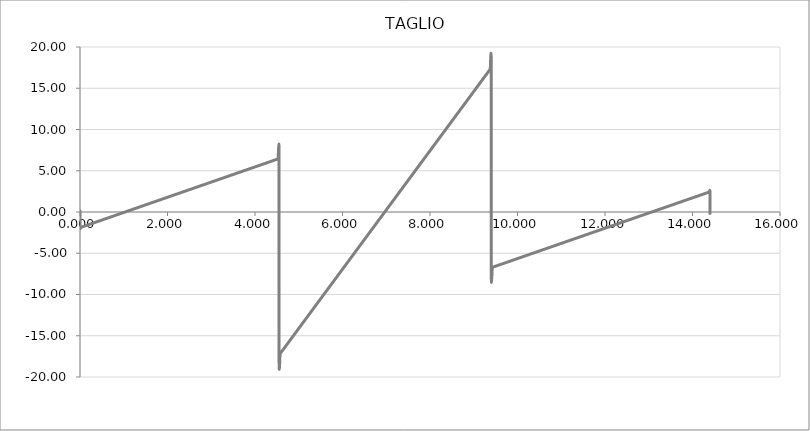
| Category | Series 1 |
|---|---|
| 0.0 | 0 |
| 0.0 | 0 |
| 0.0 | 0 |
| 0.0 | 0 |
| 0.0 | 0 |
| 0.0 | 0 |
| 0.0 | 0 |
| 0.0 | 0 |
| 0.0 | 0 |
| 0.0 | 0 |
| 0.0 | 0 |
| 0.0 | 0 |
| 0.0 | 0 |
| 0.0 | 0 |
| 0.0 | 0 |
| 0.0 | 0 |
| 0.0 | 0 |
| 0.0 | 0 |
| 0.0 | 0 |
| 0.0 | 0 |
| 0.0 | 0 |
| 0.0 | 0 |
| 0.0 | 0 |
| 0.0 | 0 |
| 0.0 | 0 |
| 0.0 | 0 |
| 0.0 | 0 |
| 0.0 | 0 |
| 0.0 | 0 |
| 0.0 | 0 |
| 0.0 | 0 |
| 0.0 | 0 |
| 0.0 | 0 |
| 0.0 | 0 |
| 0.0 | 0 |
| 0.0 | 0 |
| 0.0 | 0 |
| 0.0 | 0 |
| 0.0 | 0 |
| 0.0 | 0 |
| 0.0 | 0 |
| 0.0 | 0 |
| 0.0 | 0 |
| 0.0 | 0 |
| 0.0 | 0 |
| 0.0 | 0 |
| 0.0 | 0 |
| 0.0 | 0 |
| 0.0 | 0 |
| 0.0 | 0 |
| 0.0 | 0 |
| 0.0 | 0 |
| 0.0 | 0 |
| 0.0 | 0 |
| 0.0 | 0 |
| 0.0 | 0 |
| 0.0 | 0 |
| 0.0 | 0 |
| 0.0 | 0 |
| 0.0 | 0 |
| 0.0 | 0 |
| 0.0 | 0 |
| 0.0 | 0 |
| 0.0 | 0 |
| 0.0 | 0 |
| 0.0 | 0 |
| 0.0 | 0 |
| 0.0 | 0 |
| 0.0 | 0 |
| 0.0 | 0 |
| 0.0 | 0 |
| 0.0 | 0 |
| 0.0 | 0 |
| 0.0 | 0 |
| 0.0 | 0 |
| 0.0 | 0 |
| 0.0 | 0 |
| 0.0 | 0 |
| 0.0 | 0 |
| 0.0 | 0 |
| 0.0 | 0 |
| 0.0 | 0 |
| 0.0 | 0 |
| 0.0 | 0 |
| 0.0 | 0 |
| 0.0 | 0 |
| 0.0 | 0 |
| 0.0 | 0 |
| 0.0 | 0 |
| 0.0 | 0 |
| 0.0 | 0 |
| 0.0 | 0 |
| 0.0 | 0 |
| 0.0 | 0 |
| 0.0 | 0 |
| 0.0 | 0 |
| 0.0 | 0 |
| 0.0 | 0 |
| 0.0 | 0 |
| 0.0 | 0 |
| 0.0 | 0 |
| 0.0 | -1.895 |
| 0.02275 | -1.853 |
| 0.0455 | -1.811 |
| 0.06825 | -1.769 |
| 0.091 | -1.727 |
| 0.11374999999999999 | -1.686 |
| 0.1365 | -1.644 |
| 0.15925 | -1.602 |
| 0.182 | -1.56 |
| 0.20475 | -1.518 |
| 0.22749999999999998 | -1.476 |
| 0.25025 | -1.434 |
| 0.273 | -1.393 |
| 0.29575 | -1.351 |
| 0.3185 | -1.309 |
| 0.34125 | -1.267 |
| 0.364 | -1.225 |
| 0.38675 | -1.183 |
| 0.4095 | -1.141 |
| 0.43224999999999997 | -1.099 |
| 0.45499999999999996 | -1.058 |
| 0.47775 | -1.016 |
| 0.5005 | -0.974 |
| 0.52325 | -0.932 |
| 0.546 | -0.89 |
| 0.56875 | -0.848 |
| 0.5915 | -0.806 |
| 0.61425 | -0.765 |
| 0.637 | -0.723 |
| 0.65975 | -0.681 |
| 0.6825 | -0.639 |
| 0.7052499999999999 | -0.597 |
| 0.728 | -0.555 |
| 0.75075 | -0.513 |
| 0.7735 | -0.472 |
| 0.79625 | -0.43 |
| 0.819 | -0.388 |
| 0.84175 | -0.346 |
| 0.8644999999999999 | -0.304 |
| 0.88725 | -0.262 |
| 0.9099999999999999 | -0.22 |
| 0.93275 | -0.179 |
| 0.9555 | -0.137 |
| 0.97825 | -0.095 |
| 1.001 | -0.053 |
| 1.02375 | -0.011 |
| 1.0465 | 0.031 |
| 1.06925 | 0.073 |
| 1.092 | 0.114 |
| 1.11475 | 0.156 |
| 1.1375 | 0.198 |
| 1.16025 | 0.24 |
| 1.183 | 0.282 |
| 1.2057499999999999 | 0.324 |
| 1.2285 | 0.366 |
| 1.25125 | 0.407 |
| 1.274 | 0.449 |
| 1.29675 | 0.491 |
| 1.3195 | 0.533 |
| 1.34225 | 0.575 |
| 1.365 | 0.617 |
| 1.38775 | 0.659 |
| 1.4104999999999999 | 0.7 |
| 1.43325 | 0.742 |
| 1.456 | 0.784 |
| 1.47875 | 0.826 |
| 1.5015 | 0.868 |
| 1.5242499999999999 | 0.91 |
| 1.547 | 0.952 |
| 1.56975 | 0.994 |
| 1.5925 | 1.035 |
| 1.6152499999999999 | 1.077 |
| 1.638 | 1.119 |
| 1.66075 | 1.161 |
| 1.6835 | 1.203 |
| 1.70625 | 1.245 |
| 1.7289999999999999 | 1.287 |
| 1.75175 | 1.328 |
| 1.7745 | 1.37 |
| 1.79725 | 1.412 |
| 1.8199999999999998 | 1.454 |
| 1.8427499999999999 | 1.496 |
| 1.8655 | 1.538 |
| 1.88825 | 1.58 |
| 1.911 | 1.621 |
| 1.9337499999999999 | 1.663 |
| 1.9565 | 1.705 |
| 1.97925 | 1.747 |
| 2.002 | 1.789 |
| 2.02475 | 1.831 |
| 2.0475 | 1.873 |
| 2.07025 | 1.914 |
| 2.093 | 1.956 |
| 2.11575 | 1.998 |
| 2.1385 | 2.04 |
| 2.16125 | 2.082 |
| 2.184 | 2.124 |
| 2.20675 | 2.166 |
| 2.2295 | 2.207 |
| 2.25225 | 2.249 |
| 2.275 | 2.291 |
| 2.2977499999999997 | 2.333 |
| 2.3205 | 2.375 |
| 2.34325 | 2.417 |
| 2.366 | 2.459 |
| 2.38875 | 2.5 |
| 2.4114999999999998 | 2.542 |
| 2.43425 | 2.584 |
| 2.457 | 2.626 |
| 2.47975 | 2.668 |
| 2.5025 | 2.71 |
| 2.5252499999999998 | 2.752 |
| 2.548 | 2.793 |
| 2.57075 | 2.835 |
| 2.5935 | 2.877 |
| 2.61625 | 2.919 |
| 2.639 | 2.961 |
| 2.66175 | 3.003 |
| 2.6845 | 3.045 |
| 2.7072499999999997 | 3.087 |
| 2.73 | 3.128 |
| 2.75275 | 3.17 |
| 2.7755 | 3.212 |
| 2.79825 | 3.254 |
| 2.8209999999999997 | 3.296 |
| 2.84375 | 3.338 |
| 2.8665 | 3.38 |
| 2.88925 | 3.421 |
| 2.912 | 3.463 |
| 2.9347499999999997 | 3.505 |
| 2.9575 | 3.547 |
| 2.98025 | 3.589 |
| 3.003 | 3.631 |
| 3.02575 | 3.673 |
| 3.0484999999999998 | 3.714 |
| 3.07125 | 3.756 |
| 3.094 | 3.798 |
| 3.11675 | 3.84 |
| 3.1395 | 3.882 |
| 3.16225 | 3.924 |
| 3.185 | 3.966 |
| 3.20775 | 4.007 |
| 3.2304999999999997 | 4.049 |
| 3.25325 | 4.091 |
| 3.276 | 4.133 |
| 3.29875 | 4.175 |
| 3.3215 | 4.217 |
| 3.3442499999999997 | 4.259 |
| 3.367 | 4.3 |
| 3.38975 | 4.342 |
| 3.4125 | 4.384 |
| 3.43525 | 4.426 |
| 3.4579999999999997 | 4.468 |
| 3.48075 | 4.51 |
| 3.5035 | 4.552 |
| 3.52625 | 4.593 |
| 3.549 | 4.635 |
| 3.5717499999999998 | 4.677 |
| 3.5945 | 4.719 |
| 3.61725 | 4.761 |
| 3.6399999999999997 | 4.803 |
| 3.66275 | 4.845 |
| 3.6854999999999998 | 4.886 |
| 3.70825 | 4.928 |
| 3.731 | 4.97 |
| 3.7537499999999997 | 5.012 |
| 3.7765 | 5.054 |
| 3.79925 | 5.096 |
| 3.822 | 5.138 |
| 3.84475 | 5.18 |
| 3.8674999999999997 | 5.221 |
| 3.89025 | 5.263 |
| 3.913 | 5.305 |
| 3.93575 | 5.347 |
| 3.9585 | 5.389 |
| 3.9812499999999997 | 5.431 |
| 4.004 | 5.473 |
| 4.02675 | 5.514 |
| 4.0495 | 5.556 |
| 4.0722499999999995 | 5.598 |
| 4.095 | 5.64 |
| 4.11775 | 5.682 |
| 4.1405 | 5.724 |
| 4.16325 | 5.766 |
| 4.186 | 5.807 |
| 4.20875 | 5.849 |
| 4.2315 | 5.891 |
| 4.25425 | 5.933 |
| 4.277 | 5.975 |
| 4.2997499999999995 | 6.017 |
| 4.3225 | 6.059 |
| 4.34525 | 6.1 |
| 4.368 | 6.142 |
| 4.39075 | 6.184 |
| 4.4135 | 6.226 |
| 4.43625 | 6.268 |
| 4.459 | 6.31 |
| 4.48175 | 6.352 |
| 4.5045 | 6.393 |
| 4.5272499999999996 | 6.435 |
| 4.55 | 6.477 |
| 4.55 | -17.345 |
| 4.57425 | -17.171 |
| 4.5985 | -16.997 |
| 4.62275 | -16.823 |
| 4.647 | -16.649 |
| 4.67125 | -16.474 |
| 4.6955 | -16.3 |
| 4.7197499999999994 | -16.126 |
| 4.744 | -15.952 |
| 4.76825 | -15.778 |
| 4.7924999999999995 | -15.604 |
| 4.81675 | -15.43 |
| 4.841 | -15.256 |
| 4.86525 | -15.082 |
| 4.8895 | -14.907 |
| 4.913749999999999 | -14.733 |
| 4.938 | -14.559 |
| 4.96225 | -14.385 |
| 4.9864999999999995 | -14.211 |
| 5.01075 | -14.037 |
| 5.035 | -13.863 |
| 5.05925 | -13.689 |
| 5.0835 | -13.515 |
| 5.107749999999999 | -13.34 |
| 5.132 | -13.166 |
| 5.15625 | -12.992 |
| 5.180499999999999 | -12.818 |
| 5.20475 | -12.644 |
| 5.229 | -12.47 |
| 5.2532499999999995 | -12.296 |
| 5.2775 | -12.122 |
| 5.30175 | -11.947 |
| 5.326 | -11.773 |
| 5.35025 | -11.599 |
| 5.374499999999999 | -11.425 |
| 5.39875 | -11.251 |
| 5.423 | -11.077 |
| 5.4472499999999995 | -10.903 |
| 5.4715 | -10.729 |
| 5.495749999999999 | -10.555 |
| 5.52 | -10.38 |
| 5.54425 | -10.206 |
| 5.5685 | -10.032 |
| 5.59275 | -9.858 |
| 5.617 | -9.684 |
| 5.641249999999999 | -9.51 |
| 5.6655 | -9.336 |
| 5.68975 | -9.162 |
| 5.7139999999999995 | -8.988 |
| 5.73825 | -8.813 |
| 5.762499999999999 | -8.639 |
| 5.78675 | -8.465 |
| 5.811 | -8.291 |
| 5.835249999999999 | -8.117 |
| 5.8595 | -7.943 |
| 5.883749999999999 | -7.769 |
| 5.9079999999999995 | -7.595 |
| 5.93225 | -7.42 |
| 5.9565 | -7.246 |
| 5.98075 | -7.072 |
| 6.005 | -6.898 |
| 6.029249999999999 | -6.724 |
| 6.0535 | -6.55 |
| 6.07775 | -6.376 |
| 6.101999999999999 | -6.202 |
| 6.12625 | -6.028 |
| 6.150499999999999 | -5.853 |
| 6.1747499999999995 | -5.679 |
| 6.199 | -5.505 |
| 6.22325 | -5.331 |
| 6.2475 | -5.157 |
| 6.27175 | -4.983 |
| 6.295999999999999 | -4.809 |
| 6.32025 | -4.635 |
| 6.3445 | -4.461 |
| 6.3687499999999995 | -4.286 |
| 6.393 | -4.112 |
| 6.417249999999999 | -3.938 |
| 6.4415 | -3.764 |
| 6.46575 | -3.59 |
| 6.489999999999999 | -3.416 |
| 6.51425 | -3.242 |
| 6.538499999999999 | -3.068 |
| 6.562749999999999 | -2.893 |
| 6.587 | -2.719 |
| 6.61125 | -2.545 |
| 6.6354999999999995 | -2.371 |
| 6.659749999999999 | -2.197 |
| 6.683999999999999 | -2.023 |
| 6.70825 | -1.849 |
| 6.7325 | -1.675 |
| 6.756749999999999 | -1.501 |
| 6.781 | -1.326 |
| 6.805249999999999 | -1.152 |
| 6.8294999999999995 | -0.978 |
| 6.85375 | -0.804 |
| 6.878 | -0.63 |
| 6.9022499999999996 | -0.456 |
| 6.926499999999999 | -0.282 |
| 6.950749999999999 | -0.108 |
| 6.975 | 0.066 |
| 6.99925 | 0.241 |
| 7.023499999999999 | 0.415 |
| 7.04775 | 0.589 |
| 7.071999999999999 | 0.763 |
| 7.0962499999999995 | 0.937 |
| 7.1205 | 1.111 |
| 7.14475 | 1.285 |
| 7.169 | 1.459 |
| 7.193249999999999 | 1.634 |
| 7.217499999999999 | 1.808 |
| 7.24175 | 1.982 |
| 7.266 | 2.156 |
| 7.2902499999999995 | 2.33 |
| 7.314499999999999 | 2.504 |
| 7.338749999999999 | 2.678 |
| 7.3629999999999995 | 2.852 |
| 7.38725 | 3.026 |
| 7.411499999999999 | 3.201 |
| 7.43575 | 3.375 |
| 7.459999999999999 | 3.549 |
| 7.484249999999999 | 3.723 |
| 7.5085 | 3.897 |
| 7.53275 | 4.071 |
| 7.5569999999999995 | 4.245 |
| 7.581249999999999 | 4.419 |
| 7.605499999999999 | 4.593 |
| 7.62975 | 4.768 |
| 7.654 | 4.942 |
| 7.678249999999999 | 5.116 |
| 7.7025 | 5.29 |
| 7.726749999999999 | 5.464 |
| 7.7509999999999994 | 5.638 |
| 7.77525 | 5.812 |
| 7.7995 | 5.986 |
| 7.8237499999999995 | 6.16 |
| 7.847999999999999 | 6.335 |
| 7.872249999999999 | 6.509 |
| 7.8965 | 6.683 |
| 7.92075 | 6.857 |
| 7.944999999999999 | 7.031 |
| 7.969249999999999 | 7.205 |
| 7.993499999999999 | 7.379 |
| 8.01775 | 7.553 |
| 8.042 | 7.728 |
| 8.06625 | 7.902 |
| 8.090499999999999 | 8.076 |
| 8.114749999999999 | 8.25 |
| 8.139 | 8.424 |
| 8.16325 | 8.598 |
| 8.1875 | 8.772 |
| 8.211749999999999 | 8.946 |
| 8.235999999999999 | 9.12 |
| 8.26025 | 9.295 |
| 8.2845 | 9.469 |
| 8.30875 | 9.643 |
| 8.332999999999998 | 9.817 |
| 8.357249999999999 | 9.991 |
| 8.381499999999999 | 10.165 |
| 8.40575 | 10.339 |
| 8.43 | 10.513 |
| 8.45425 | 10.687 |
| 8.4785 | 10.862 |
| 8.502749999999999 | 11.036 |
| 8.527 | 11.21 |
| 8.55125 | 11.384 |
| 8.575499999999998 | 11.558 |
| 8.59975 | 11.732 |
| 8.623999999999999 | 11.906 |
| 8.648249999999999 | 12.08 |
| 8.6725 | 12.255 |
| 8.69675 | 12.429 |
| 8.721 | 12.603 |
| 8.745249999999999 | 12.777 |
| 8.769499999999999 | 12.951 |
| 8.79375 | 13.125 |
| 8.818 | 13.299 |
| 8.84225 | 13.473 |
| 8.866499999999998 | 13.647 |
| 8.89075 | 13.822 |
| 8.915 | 13.996 |
| 8.93925 | 14.17 |
| 8.9635 | 14.344 |
| 8.987749999999998 | 14.518 |
| 9.012 | 14.692 |
| 9.036249999999999 | 14.866 |
| 9.0605 | 15.04 |
| 9.08475 | 15.214 |
| 9.108999999999998 | 15.389 |
| 9.13325 | 15.563 |
| 9.157499999999999 | 15.737 |
| 9.18175 | 15.911 |
| 9.206 | 16.085 |
| 9.230249999999998 | 16.259 |
| 9.2545 | 16.433 |
| 9.278749999999999 | 16.607 |
| 9.302999999999999 | 16.782 |
| 9.32725 | 16.956 |
| 9.3515 | 17.13 |
| 9.37575 | 17.304 |
| 9.399999999999999 | 17.478 |
| 9.399999999999999 | -6.749 |
| 9.424999999999999 | -6.703 |
| 9.45 | -6.657 |
| 9.474999999999998 | -6.611 |
| 9.499999999999998 | -6.565 |
| 9.524999999999999 | -6.519 |
| 9.549999999999999 | -6.473 |
| 9.575 | -6.427 |
| 9.599999999999998 | -6.381 |
| 9.624999999999998 | -6.335 |
| 9.649999999999999 | -6.289 |
| 9.674999999999999 | -6.243 |
| 9.7 | -6.197 |
| 9.724999999999998 | -6.151 |
| 9.749999999999998 | -6.105 |
| 9.774999999999999 | -6.059 |
| 9.799999999999999 | -6.013 |
| 9.825 | -5.967 |
| 9.849999999999998 | -5.921 |
| 9.874999999999998 | -5.875 |
| 9.899999999999999 | -5.829 |
| 9.924999999999999 | -5.783 |
| 9.95 | -5.737 |
| 9.974999999999998 | -5.691 |
| 9.999999999999998 | -5.645 |
| 10.024999999999999 | -5.599 |
| 10.049999999999999 | -5.553 |
| 10.075 | -5.507 |
| 10.099999999999998 | -5.461 |
| 10.124999999999998 | -5.415 |
| 10.149999999999999 | -5.369 |
| 10.174999999999999 | -5.323 |
| 10.2 | -5.277 |
| 10.224999999999998 | -5.231 |
| 10.249999999999998 | -5.185 |
| 10.274999999999999 | -5.139 |
| 10.299999999999999 | -5.093 |
| 10.325 | -5.047 |
| 10.349999999999998 | -5.001 |
| 10.374999999999998 | -4.955 |
| 10.399999999999999 | -4.909 |
| 10.424999999999999 | -4.863 |
| 10.45 | -4.817 |
| 10.474999999999998 | -4.771 |
| 10.499999999999998 | -4.725 |
| 10.524999999999999 | -4.679 |
| 10.549999999999999 | -4.633 |
| 10.575 | -4.587 |
| 10.599999999999998 | -4.541 |
| 10.624999999999998 | -4.495 |
| 10.649999999999999 | -4.449 |
| 10.674999999999999 | -4.403 |
| 10.7 | -4.357 |
| 10.724999999999998 | -4.311 |
| 10.749999999999998 | -4.265 |
| 10.774999999999999 | -4.219 |
| 10.799999999999999 | -4.173 |
| 10.825 | -4.127 |
| 10.849999999999998 | -4.081 |
| 10.874999999999998 | -4.035 |
| 10.899999999999999 | -3.989 |
| 10.924999999999999 | -3.943 |
| 10.95 | -3.897 |
| 10.974999999999998 | -3.851 |
| 10.999999999999998 | -3.805 |
| 11.024999999999999 | -3.759 |
| 11.049999999999999 | -3.713 |
| 11.075 | -3.667 |
| 11.099999999999998 | -3.621 |
| 11.124999999999998 | -3.575 |
| 11.149999999999999 | -3.529 |
| 11.174999999999999 | -3.483 |
| 11.2 | -3.437 |
| 11.224999999999998 | -3.391 |
| 11.249999999999998 | -3.345 |
| 11.274999999999999 | -3.299 |
| 11.299999999999999 | -3.253 |
| 11.325 | -3.207 |
| 11.349999999999998 | -3.161 |
| 11.374999999999998 | -3.115 |
| 11.399999999999999 | -3.069 |
| 11.424999999999999 | -3.023 |
| 11.45 | -2.977 |
| 11.474999999999998 | -2.931 |
| 11.499999999999998 | -2.885 |
| 11.524999999999999 | -2.839 |
| 11.549999999999999 | -2.793 |
| 11.575 | -2.747 |
| 11.599999999999998 | -2.701 |
| 11.624999999999998 | -2.655 |
| 11.649999999999999 | -2.609 |
| 11.674999999999999 | -2.563 |
| 11.7 | -2.517 |
| 11.724999999999998 | -2.471 |
| 11.749999999999998 | -2.425 |
| 11.774999999999999 | -2.379 |
| 11.799999999999999 | -2.333 |
| 11.825 | -2.287 |
| 11.849999999999998 | -2.241 |
| 11.874999999999998 | -2.195 |
| 11.899999999999999 | -2.149 |
| 11.924999999999999 | -2.103 |
| 11.95 | -2.057 |
| 11.974999999999998 | -2.011 |
| 11.999999999999998 | -1.965 |
| 12.024999999999999 | -1.919 |
| 12.049999999999999 | -1.873 |
| 12.075 | -1.827 |
| 12.099999999999998 | -1.781 |
| 12.124999999999998 | -1.735 |
| 12.149999999999999 | -1.689 |
| 12.174999999999999 | -1.643 |
| 12.2 | -1.597 |
| 12.224999999999998 | -1.551 |
| 12.249999999999998 | -1.505 |
| 12.274999999999999 | -1.459 |
| 12.299999999999999 | -1.413 |
| 12.325 | -1.367 |
| 12.349999999999998 | -1.321 |
| 12.374999999999998 | -1.275 |
| 12.399999999999999 | -1.229 |
| 12.424999999999999 | -1.183 |
| 12.45 | -1.137 |
| 12.474999999999998 | -1.091 |
| 12.499999999999998 | -1.045 |
| 12.524999999999999 | -0.999 |
| 12.549999999999999 | -0.953 |
| 12.575 | -0.907 |
| 12.599999999999998 | -0.861 |
| 12.624999999999998 | -0.815 |
| 12.649999999999999 | -0.769 |
| 12.674999999999999 | -0.723 |
| 12.7 | -0.677 |
| 12.724999999999998 | -0.631 |
| 12.749999999999998 | -0.585 |
| 12.774999999999999 | -0.539 |
| 12.799999999999999 | -0.493 |
| 12.825 | -0.447 |
| 12.849999999999998 | -0.401 |
| 12.874999999999998 | -0.355 |
| 12.899999999999999 | -0.309 |
| 12.924999999999999 | -0.263 |
| 12.95 | -0.217 |
| 12.974999999999998 | -0.171 |
| 12.999999999999998 | -0.125 |
| 13.024999999999999 | -0.079 |
| 13.049999999999999 | -0.033 |
| 13.075 | 0.013 |
| 13.099999999999998 | 0.059 |
| 13.124999999999998 | 0.105 |
| 13.149999999999999 | 0.151 |
| 13.174999999999999 | 0.197 |
| 13.2 | 0.243 |
| 13.224999999999998 | 0.289 |
| 13.249999999999998 | 0.335 |
| 13.274999999999999 | 0.381 |
| 13.299999999999999 | 0.427 |
| 13.325 | 0.473 |
| 13.349999999999998 | 0.519 |
| 13.374999999999998 | 0.565 |
| 13.399999999999999 | 0.611 |
| 13.424999999999999 | 0.657 |
| 13.45 | 0.703 |
| 13.474999999999998 | 0.749 |
| 13.5 | 0.795 |
| 13.524999999999999 | 0.841 |
| 13.549999999999999 | 0.887 |
| 13.575 | 0.933 |
| 13.599999999999998 | 0.979 |
| 13.625 | 1.025 |
| 13.649999999999999 | 1.071 |
| 13.674999999999999 | 1.117 |
| 13.7 | 1.163 |
| 13.724999999999998 | 1.209 |
| 13.75 | 1.255 |
| 13.774999999999999 | 1.301 |
| 13.799999999999999 | 1.347 |
| 13.825 | 1.393 |
| 13.849999999999998 | 1.439 |
| 13.875 | 1.485 |
| 13.899999999999999 | 1.531 |
| 13.924999999999999 | 1.577 |
| 13.95 | 1.623 |
| 13.974999999999998 | 1.669 |
| 14.0 | 1.715 |
| 14.024999999999999 | 1.761 |
| 14.049999999999999 | 1.807 |
| 14.075 | 1.853 |
| 14.099999999999998 | 1.899 |
| 14.125 | 1.945 |
| 14.149999999999999 | 1.991 |
| 14.174999999999999 | 2.037 |
| 14.2 | 2.083 |
| 14.224999999999998 | 2.129 |
| 14.25 | 2.175 |
| 14.274999999999999 | 2.221 |
| 14.299999999999999 | 2.267 |
| 14.325 | 2.313 |
| 14.349999999999998 | 2.359 |
| 14.375 | 2.405 |
| 14.399999999999999 | 2.451 |
| 14.399999999999999 | 0 |
| 14.399999999999999 | 0 |
| 14.399999999999999 | 0 |
| 14.399999999999999 | 0 |
| 14.399999999999999 | 0 |
| 14.399999999999999 | 0 |
| 14.399999999999999 | 0 |
| 14.399999999999999 | 0 |
| 14.399999999999999 | 0 |
| 14.399999999999999 | 0 |
| 14.399999999999999 | 0 |
| 14.399999999999999 | 0 |
| 14.399999999999999 | 0 |
| 14.399999999999999 | 0 |
| 14.399999999999999 | 0 |
| 14.399999999999999 | 0 |
| 14.399999999999999 | 0 |
| 14.399999999999999 | 0 |
| 14.399999999999999 | 0 |
| 14.399999999999999 | 0 |
| 14.399999999999999 | 0 |
| 14.399999999999999 | 0 |
| 14.399999999999999 | 0 |
| 14.399999999999999 | 0 |
| 14.399999999999999 | 0 |
| 14.399999999999999 | 0 |
| 14.399999999999999 | 0 |
| 14.399999999999999 | 0 |
| 14.399999999999999 | 0 |
| 14.399999999999999 | 0 |
| 14.399999999999999 | 0 |
| 14.399999999999999 | 0 |
| 14.399999999999999 | 0 |
| 14.399999999999999 | 0 |
| 14.399999999999999 | 0 |
| 14.399999999999999 | 0 |
| 14.399999999999999 | 0 |
| 14.399999999999999 | 0 |
| 14.399999999999999 | 0 |
| 14.399999999999999 | 0 |
| 14.399999999999999 | 0 |
| 14.399999999999999 | 0 |
| 14.399999999999999 | 0 |
| 14.399999999999999 | 0 |
| 14.399999999999999 | 0 |
| 14.399999999999999 | 0 |
| 14.399999999999999 | 0 |
| 14.399999999999999 | 0 |
| 14.399999999999999 | 0 |
| 14.399999999999999 | 0 |
| 14.399999999999999 | 0 |
| 14.399999999999999 | 0 |
| 14.399999999999999 | 0 |
| 14.399999999999999 | 0 |
| 14.399999999999999 | 0 |
| 14.399999999999999 | 0 |
| 14.399999999999999 | 0 |
| 14.399999999999999 | 0 |
| 14.399999999999999 | 0 |
| 14.399999999999999 | 0 |
| 14.399999999999999 | 0 |
| 14.399999999999999 | 0 |
| 14.399999999999999 | 0 |
| 14.399999999999999 | 0 |
| 14.399999999999999 | 0 |
| 14.399999999999999 | 0 |
| 14.399999999999999 | 0 |
| 14.399999999999999 | 0 |
| 14.399999999999999 | 0 |
| 14.399999999999999 | 0 |
| 14.399999999999999 | 0 |
| 14.399999999999999 | 0 |
| 14.399999999999999 | 0 |
| 14.399999999999999 | 0 |
| 14.399999999999999 | 0 |
| 14.399999999999999 | 0 |
| 14.399999999999999 | 0 |
| 14.399999999999999 | 0 |
| 14.399999999999999 | 0 |
| 14.399999999999999 | 0 |
| 14.399999999999999 | 0 |
| 14.399999999999999 | 0 |
| 14.399999999999999 | 0 |
| 14.399999999999999 | 0 |
| 14.399999999999999 | 0 |
| 14.399999999999999 | 0 |
| 14.399999999999999 | 0 |
| 14.399999999999999 | 0 |
| 14.399999999999999 | 0 |
| 14.399999999999999 | 0 |
| 14.399999999999999 | 0 |
| 14.399999999999999 | 0 |
| 14.399999999999999 | 0 |
| 14.399999999999999 | 0 |
| 14.399999999999999 | 0 |
| 14.399999999999999 | 0 |
| 14.399999999999999 | 0 |
| 14.399999999999999 | 0 |
| 14.399999999999999 | 0 |
| 14.399999999999999 | 0 |
| 14.399999999999999 | 0 |